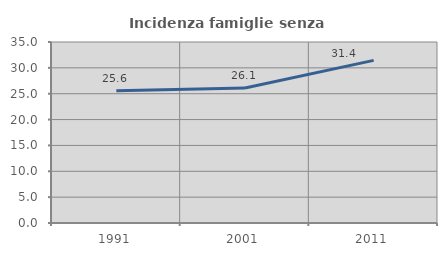
| Category | Incidenza famiglie senza nuclei |
|---|---|
| 1991.0 | 25.592 |
| 2001.0 | 26.095 |
| 2011.0 | 31.442 |